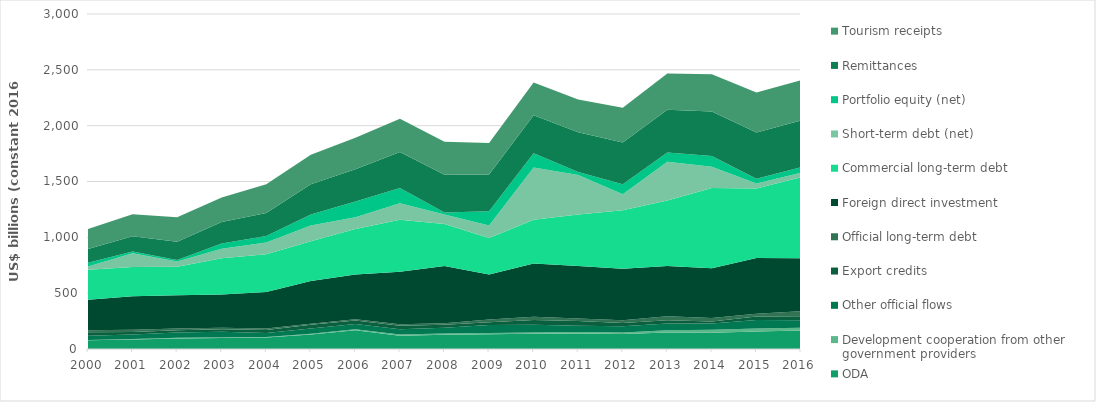
| Category | ODA | Development cooperation from other government providers | Other official flows | Export credits  | Official long-term debt | Foreign direct investment | Commercial long-term debt | Short-term debt (net) | Portfolio equity (net) | Remittances | Tourism receipts |
|---|---|---|---|---|---|---|---|---|---|---|---|
| 2000.0 | 77771890000 | 1824312329.526 | 39965060000 | 31020750000 | 17687755690.808 | 273787625491.992 | 267107324729.229 | 29516338697.169 | 34457032310.235 | 122101472655.786 | 180162433345.626 |
| 2001.0 | 85012100000 | 3548440989.09 | 40570760000 | 23758040000 | 19147537578.66 | 301052351777.333 | 262230856346.878 | 122518617646.064 | 14809822126.018 | 136879673258.231 | 197113926481.07 |
| 2002.0 | 94140060000 | 6714298277.876 | 47792030000 | 18618660000 | 15309430329.736 | 299834355553.582 | 254164454109.356 | 45943693029.478 | 15111142727.941 | 162763302788.767 | 219563904951.087 |
| 2003.0 | 98142190000 | 6573762791.382 | 50553530000 | 22173790000 | 12144142558.994 | 297909250943.73 | 325241311408.19 | 85614422702.27 | 45965021464.904 | 192627061341.32 | 219855404720.618 |
| 2004.0 | 102233690000 | 5936523929.503 | 35877760000 | 25732170000 | 13269789191.335 | 327714175878.39 | 337697877012.472 | 104409197291.536 | 58562374734.617 | 205580353475.454 | 257439877662.154 |
| 2005.0 | 129537180000 | 6021220525.329 | 49123790000 | 32171950000 | 9830428536.288 | 382347103796.826 | 355114795859.197 | 142524131285.612 | 98230435511.879 | 269540835341.584 | 265545786578.064 |
| 2006.0 | 168618570000 | 7944019481.803 | 47658820000 | 30342750000 | 12540494434.01 | 400484016880.115 | 406260553430.196 | 106332448053.014 | 139925294651.744 | 290338041870.322 | 280762553049.616 |
| 2007.0 | 119730290000 | 9666592097.896 | 48346430000 | 30881440000 | 13151567189.611 | 469434324766.471 | 466806438660.156 | 147505913753.837 | 137177089317.886 | 320683930593.181 | 299420029406.352 |
| 2008.0 | 127313940000 | 12502947292.305 | 50064770000 | 27929050000 | 12459374841.112 | 513070598246.607 | 376897975154.48 | 84912751436.238 | 16145158675.439 | 338833101147.677 | 295320437116.019 |
| 2009.0 | 131626790000 | 11068856931.681 | 71493490000 | 26046880000 | 24864910691.56 | 401228138650.941 | 327494740512.801 | 111111001504.948 | 129095826715.67 | 327963379199.609 | 283636998659.922 |
| 2010.0 | 137039650000 | 11480280310.101 | 68073870000 | 44199230000 | 29099728273.759 | 475684744461.456 | 391541856282.586 | 468953347593.259 | 126972268502.415 | 340169355231.106 | 293939268855.299 |
| 2011.0 | 138223610000 | 14381038650.549 | 54756110000 | 43070070000 | 23226579449.157 | 470693119759.184 | 460434645608.117 | 352903870875.012 | 27298745277.111 | 355957993901.033 | 293189785626.272 |
| 2012.0 | 134679350000 | 12079564333.306 | 56830870000 | 28247990000 | 26023973301.287 | 461446909276.55 | 522619423622.973 | 142958586182.898 | 91385296784.446 | 373015527271.784 | 310115011731.766 |
| 2013.0 | 146739960000 | 22222175120.361 | 60070970000 | 29373160000 | 35681346413.088 | 450193338662.922 | 584551669892.43 | 348305058231.95 | 81708738561.817 | 383472562709.418 | 325227340338.016 |
| 2014.0 | 144986730000 | 27944144047.179 | 55227790000 | 17213280000 | 33013552563.009 | 445638227058.685 | 718443957875.473 | 189739086145.35 | 96363717057.331 | 397900610567.206 | 334986438405.596 |
| 2015.0 | 156950760000 | 26009649883.132 | 76124350000 | 31150730000 | 25261259000.563 | 500058626926.122 | 622781293595.76 | 44523434548.063 | 40909502041.898 | 414499408451.514 | 358154024865.329 |
| 2016.0 | 166904210000 | 23113693793.411 | 66406740000 | 36446240000 | 44751809945.2 | 476035790720.972 | 723277547000 | 41438444000 | 49256792983.724 | 417867077820.374 | 361073600000 |